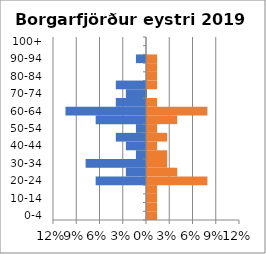
| Category | % Men | % Women |
|---|---|---|
| 0-4 | 0 | 0.013 |
| 5-9 | 0 | 0.013 |
| 10-14 | 0 | 0.013 |
| 15-19 | 0 | 0.013 |
| 20-24 | -0.065 | 0.078 |
| 25-29 | -0.026 | 0.039 |
| 30-34 | -0.078 | 0.026 |
| 35-39 | -0.013 | 0.026 |
| 40-44 | -0.026 | 0.013 |
| 45-49 | -0.039 | 0.026 |
| 50-54 | -0.013 | 0.013 |
| 55-59 | -0.065 | 0.039 |
| 60-64 | -0.104 | 0.078 |
| 65-69 | -0.039 | 0.013 |
| 70-74 | -0.026 | 0 |
| 75-79 | -0.039 | 0.013 |
| 80-84 | 0 | 0.013 |
| 85-89 | 0 | 0.013 |
| 90-94 | -0.013 | 0.013 |
| 95-99 | 0 | 0 |
| 100+ | 0 | 0 |